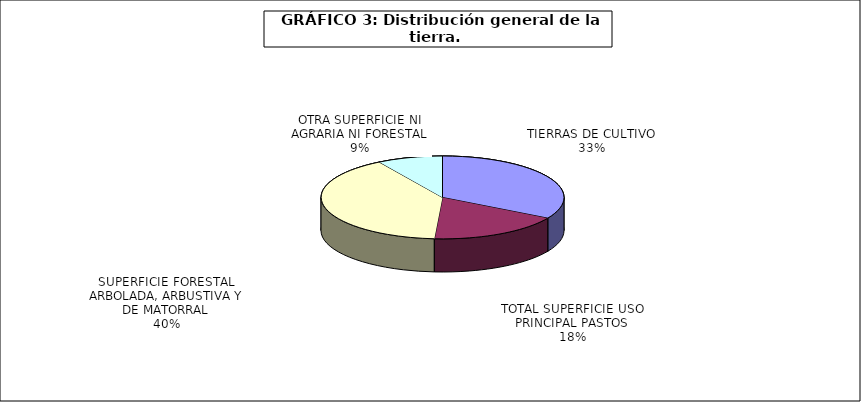
| Category | Series 0 |
|---|---|
| TIERRAS DE CULTIVO | 16861958 |
| TOTAL SUPERFICIE USO PRINCIPAL PASTOS | 8974797 |
| SUPERFICIE FORESTAL ARBOLADA, ARBUSTIVA Y DE MATORRAL | 20345749 |
| OTRA SUPERFICIE NI AGRARIA NI FORESTAL | 4413557 |